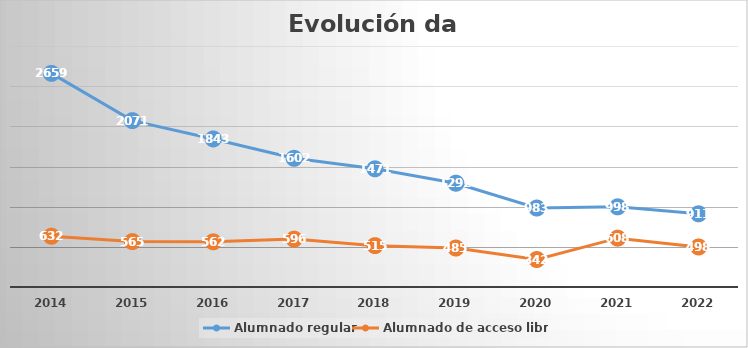
| Category | Alumnado regular | Alumnado de acceso libre |
|---|---|---|
| 2014 | 2659 | 632 |
| 2015 | 2071 | 565 |
| 2016 | 1843 | 562 |
| 2017 | 1602 | 596 |
| 2018 | 1471 | 515 |
| 2019 | 1292 | 485 |
| 2020 | 983 | 342 |
| 2021 | 998 | 608 |
| 2022 | 911 | 498 |